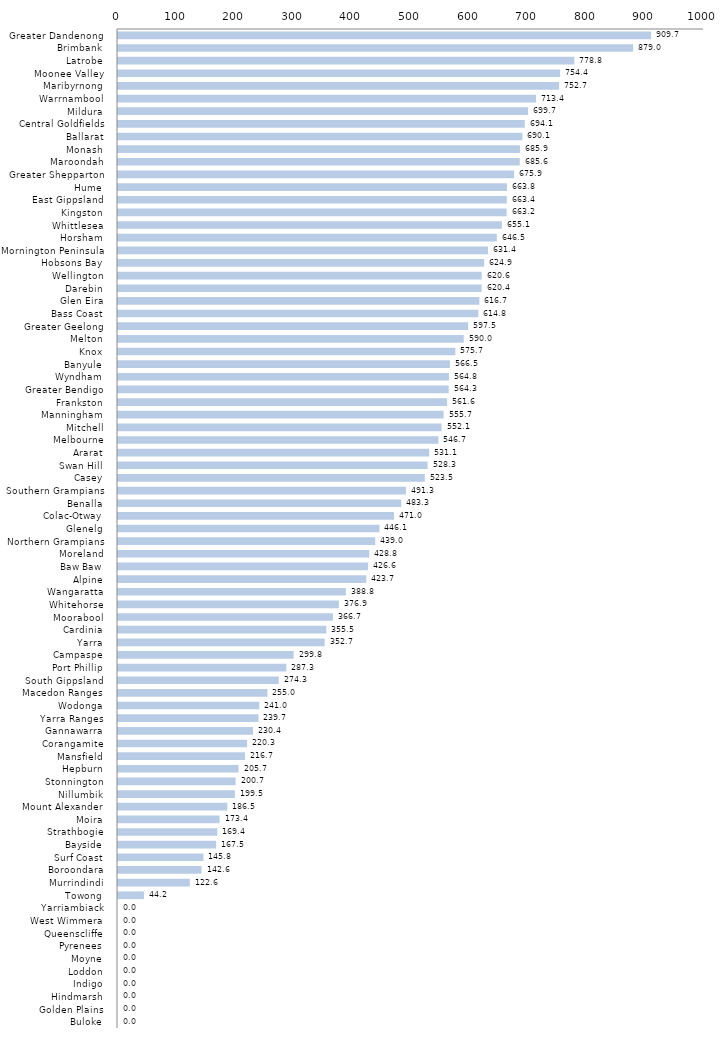
| Category | Series 0 |
|---|---|
| Greater Dandenong  | 909.71 |
| Brimbank  | 879.041 |
| Latrobe  | 778.757 |
| Moonee Valley  | 754.414 |
| Maribyrnong  | 752.672 |
| Warrnambool  | 713.377 |
| Mildura  | 699.693 |
| Central Goldfields  | 694.106 |
| Ballarat  | 690.126 |
| Monash  | 685.908 |
| Maroondah  | 685.565 |
| Greater Shepparton  | 675.911 |
| Hume  | 663.777 |
| East Gippsland  | 663.448 |
| Kingston  | 663.159 |
| Whittlesea  | 655.091 |
| Horsham  | 646.462 |
| Mornington Peninsula  | 631.387 |
| Hobsons Bay  | 624.91 |
| Wellington  | 620.623 |
| Darebin  | 620.436 |
| Glen Eira  | 616.725 |
| Bass Coast  | 614.817 |
| Greater Geelong  | 597.491 |
| Melton  | 590.012 |
| Knox  | 575.685 |
| Banyule  | 566.487 |
| Wyndham  | 564.792 |
| Greater Bendigo  | 564.298 |
| Frankston  | 561.639 |
| Manningham  | 555.697 |
| Mitchell  | 552.087 |
| Melbourne  | 546.739 |
| Ararat  | 531.116 |
| Swan Hill  | 528.31 |
| Casey  | 523.531 |
| Southern Grampians  | 491.339 |
| Benalla  | 483.347 |
| Colac-Otway  | 470.979 |
| Glenelg  | 446.131 |
| Northern Grampians  | 438.959 |
| Moreland  | 428.754 |
| Baw Baw  | 426.645 |
| Alpine  | 423.742 |
| Wangaratta  | 388.848 |
| Whitehorse  | 376.926 |
| Moorabool  | 366.742 |
| Cardinia  | 355.534 |
| Yarra  | 352.664 |
| Campaspe  | 299.786 |
| Port Phillip  | 287.287 |
| South Gippsland  | 274.293 |
| Macedon Ranges  | 254.97 |
| Wodonga  | 241.002 |
| Yarra Ranges  | 239.728 |
| Gannawarra  | 230.377 |
| Corangamite  | 220.266 |
| Mansfield  | 216.693 |
| Hepburn  | 205.732 |
| Stonnington  | 200.702 |
| Nillumbik  | 199.463 |
| Mount Alexander  | 186.533 |
| Moira  | 173.351 |
| Strathbogie  | 169.448 |
| Bayside  | 167.5 |
| Surf Coast  | 145.787 |
| Boroondara  | 142.598 |
| Murrindindi  | 122.603 |
| Towong  | 44.244 |
| Yarriambiack  | 0 |
| West Wimmera  | 0 |
| Queenscliffe  | 0 |
| Pyrenees  | 0 |
| Moyne  | 0 |
| Loddon  | 0 |
| Indigo  | 0 |
| Hindmarsh  | 0 |
| Golden Plains  | 0 |
| Buloke  | 0 |